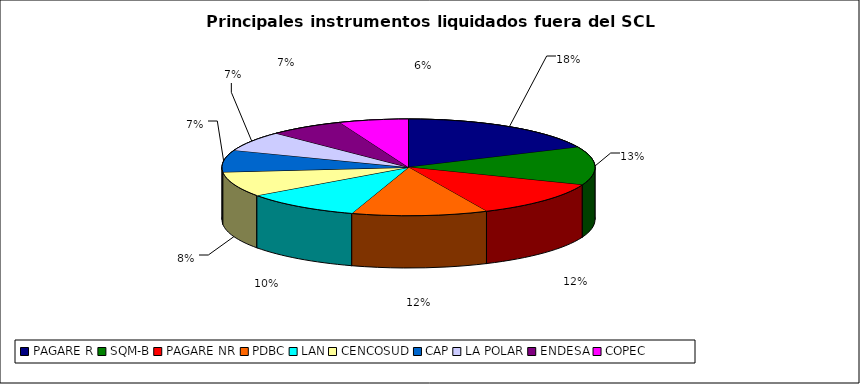
| Category | Series 0 |
|---|---|
| PAGARE R | 1377 |
| SQM-B | 965 |
| PAGARE NR | 923 |
| PDBC | 892 |
| LAN | 771 |
| CENCOSUD | 632 |
| CAP | 554 |
| LA POLAR | 505 |
| ENDESA | 496 |
| COPEC | 454 |